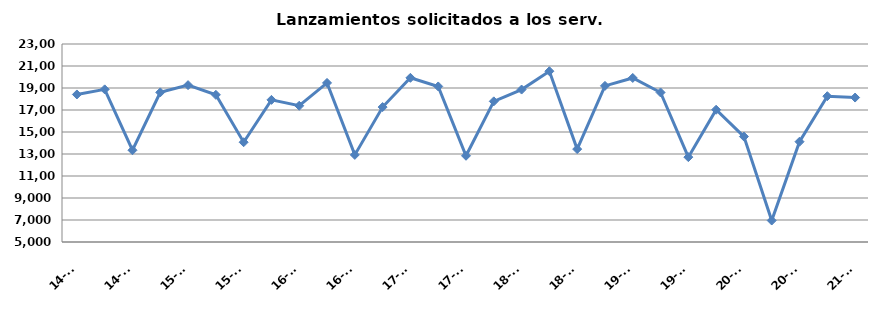
| Category | Lanzamientos solicitados a los Serv. comunes |
|---|---|
| 14-T1 | 18412 |
| 14-T2 | 18876 |
| 14-T3 | 13342 |
| 14-T4 | 18603 |
| 15-T1 | 19261 |
| 15-T2 | 18378 |
| 15-T3 | 14071 |
| 15-T4 | 17921 |
| 16-T1 | 17386 |
| 16-T2 | 19461 |
| 16-T3 | 12918 |
| 16-T4 | 17265 |
| 17-T1 | 19926 |
| 17-T2 | 19141 |
| 17-T3 | 12840 |
| 17-T4 | 17786 |
| 18-T1 | 18859 |
| 18-T2 | 20526 |
| 18-T3 | 13446 |
| 18-T4 | 19192 |
| 19-T1 | 19913 |
| 19-T2 | 18594 |
| 19-T3 | 12715 |
| 19-T4 | 17025 |
| 20-T1 | 14586 |
| 20-T2 | 6953 |
| 20-T3 | 14117 |
| 20-T4 | 18255 |
| 21-T1 | 18131 |